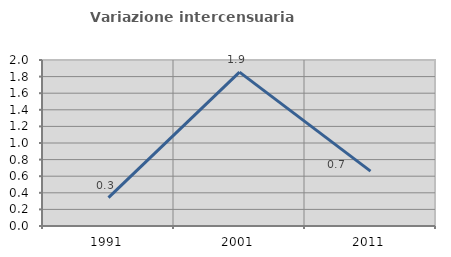
| Category | Variazione intercensuaria annua |
|---|---|
| 1991.0 | 0.342 |
| 2001.0 | 1.854 |
| 2011.0 | 0.662 |